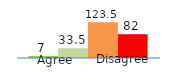
| Category | Series 0 | Series 1 | Series 2 | Series 3 |
|---|---|---|---|---|
| 0 | 7 | 33.5 | 123.5 | 82 |